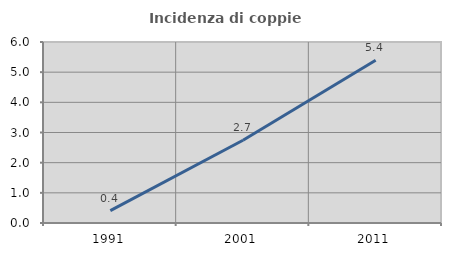
| Category | Incidenza di coppie miste |
|---|---|
| 1991.0 | 0.412 |
| 2001.0 | 2.744 |
| 2011.0 | 5.393 |